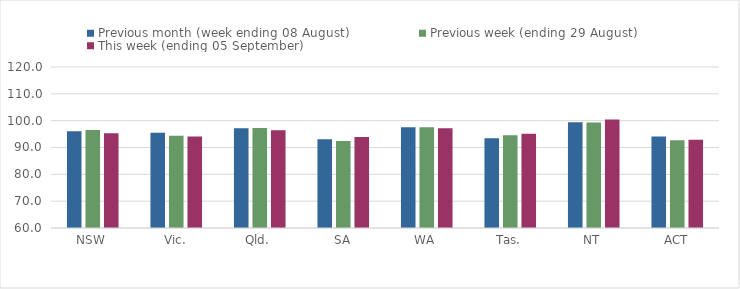
| Category | Previous month (week ending 08 August) | Previous week (ending 29 August) | This week (ending 05 September) |
|---|---|---|---|
| NSW | 96.02 | 96.49 | 95.31 |
| Vic. | 95.49 | 94.37 | 94.09 |
| Qld. | 97.17 | 97.23 | 96.45 |
| SA | 93.03 | 92.41 | 93.91 |
| WA | 97.56 | 97.58 | 97.19 |
| Tas. | 93.42 | 94.52 | 95.09 |
| NT | 99.43 | 99.28 | 100.39 |
| ACT | 94.11 | 92.69 | 92.89 |